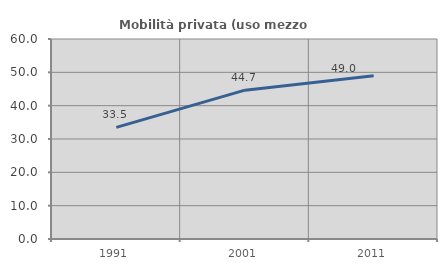
| Category | Mobilità privata (uso mezzo privato) |
|---|---|
| 1991.0 | 33.496 |
| 2001.0 | 44.654 |
| 2011.0 | 48.954 |